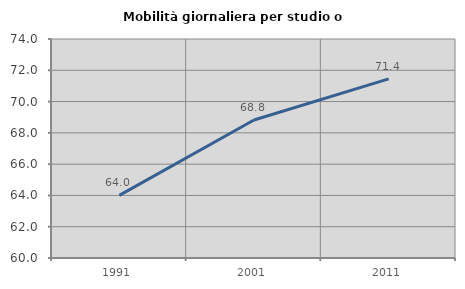
| Category | Mobilità giornaliera per studio o lavoro |
|---|---|
| 1991.0 | 64.002 |
| 2001.0 | 68.821 |
| 2011.0 | 71.447 |